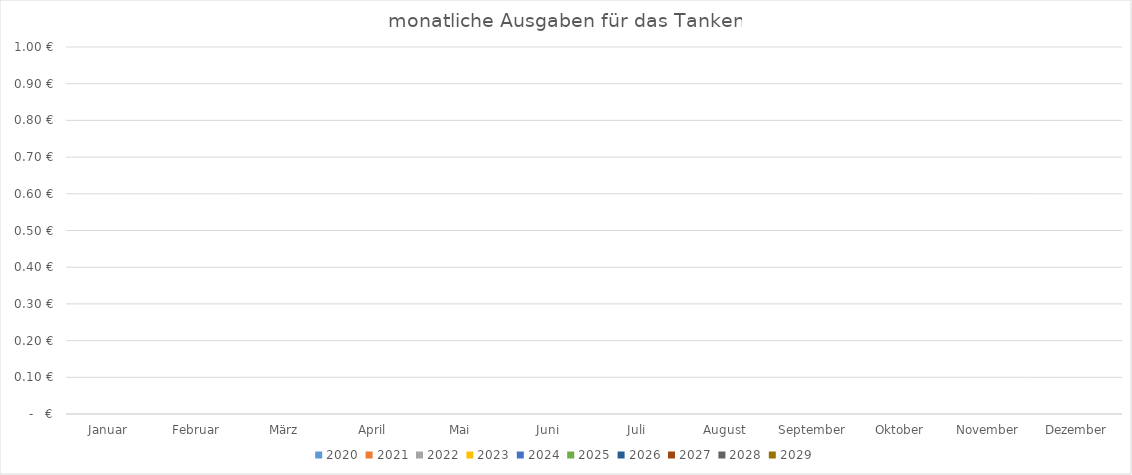
| Category | 2020 | 2021 | 2022 | 2023 | 2024 | 2025 | 2026 | 2027 | 2028 | 2029 |
|---|---|---|---|---|---|---|---|---|---|---|
| Januar | 0 | 0 | 0 | 0 | 0 | 0 | 0 | 0 | 0 | 0 |
| Februar | 0 | 0 | 0 | 0 | 0 | 0 | 0 | 0 | 0 | 0 |
| März | 0 | 0 | 0 | 0 | 0 | 0 | 0 | 0 | 0 | 0 |
| April | 0 | 0 | 0 | 0 | 0 | 0 | 0 | 0 | 0 | 0 |
| Mai | 0 | 0 | 0 | 0 | 0 | 0 | 0 | 0 | 0 | 0 |
| Juni | 0 | 0 | 0 | 0 | 0 | 0 | 0 | 0 | 0 | 0 |
| Juli | 0 | 0 | 0 | 0 | 0 | 0 | 0 | 0 | 0 | 0 |
| August | 0 | 0 | 0 | 0 | 0 | 0 | 0 | 0 | 0 | 0 |
| September | 0 | 0 | 0 | 0 | 0 | 0 | 0 | 0 | 0 | 0 |
| Oktober | 0 | 0 | 0 | 0 | 0 | 0 | 0 | 0 | 0 | 0 |
| November | 0 | 0 | 0 | 0 | 0 | 0 | 0 | 0 | 0 | 0 |
| Dezember | 0 | 0 | 0 | 0 | 0 | 0 | 0 | 0 | 0 | 0 |